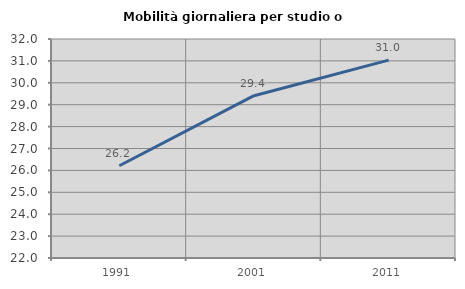
| Category | Mobilità giornaliera per studio o lavoro |
|---|---|
| 1991.0 | 26.214 |
| 2001.0 | 29.412 |
| 2011.0 | 31.034 |